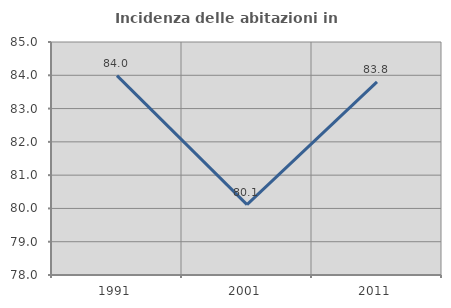
| Category | Incidenza delle abitazioni in proprietà  |
|---|---|
| 1991.0 | 83.988 |
| 2001.0 | 80.114 |
| 2011.0 | 83.805 |